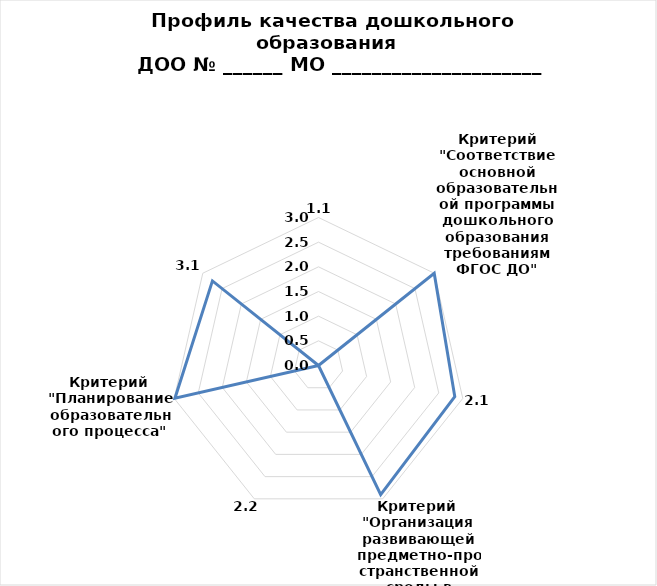
| Category | Series 0 |
|---|---|
| 0 | 0 |
| 1 | 3 |
| 2 | 2.833 |
| 3 | 2.905 |
| 4 | 0 |
| 5 | 2.985 |
| 6 | 2.75 |